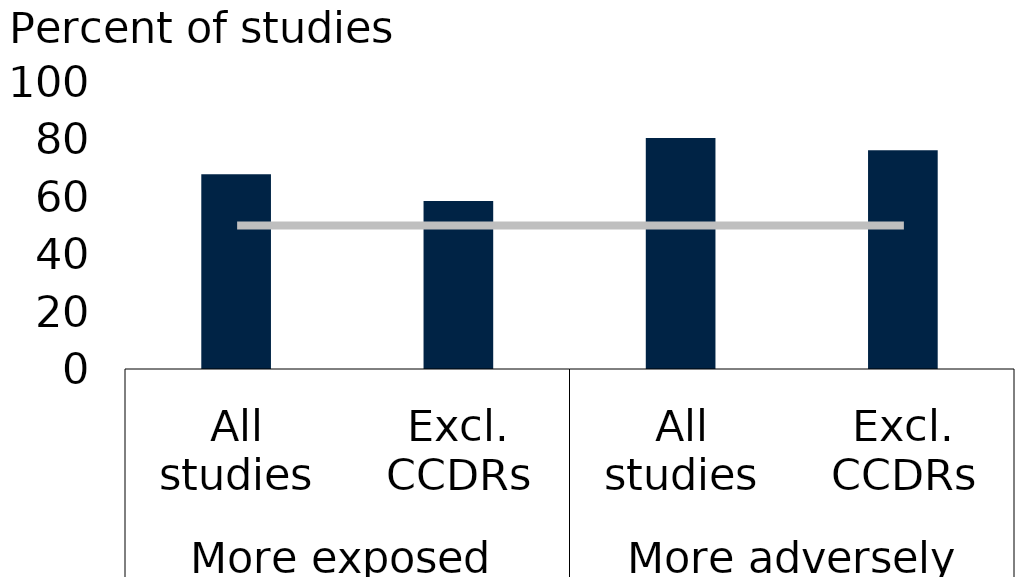
| Category | Series 0 |
|---|---|
| 0 | 67.9 |
| 1 | 58.5 |
| 2 | 80.5 |
| 3 | 76.2 |